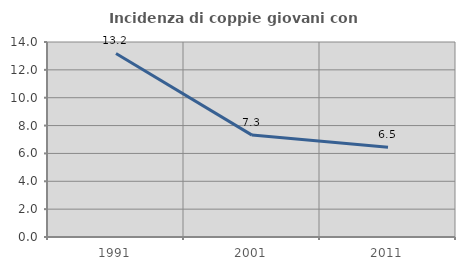
| Category | Incidenza di coppie giovani con figli |
|---|---|
| 1991.0 | 13.18 |
| 2001.0 | 7.315 |
| 2011.0 | 6.452 |